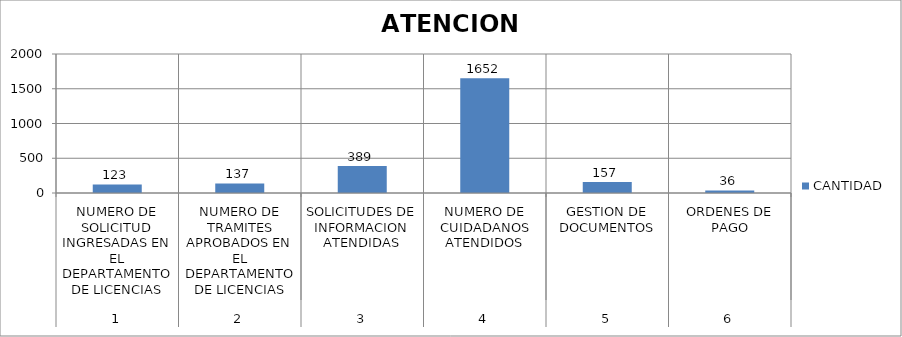
| Category | CANTIDAD |
|---|---|
| 0 | 123 |
| 1 | 137 |
| 2 | 389 |
| 3 | 1652 |
| 4 | 157 |
| 5 | 36 |